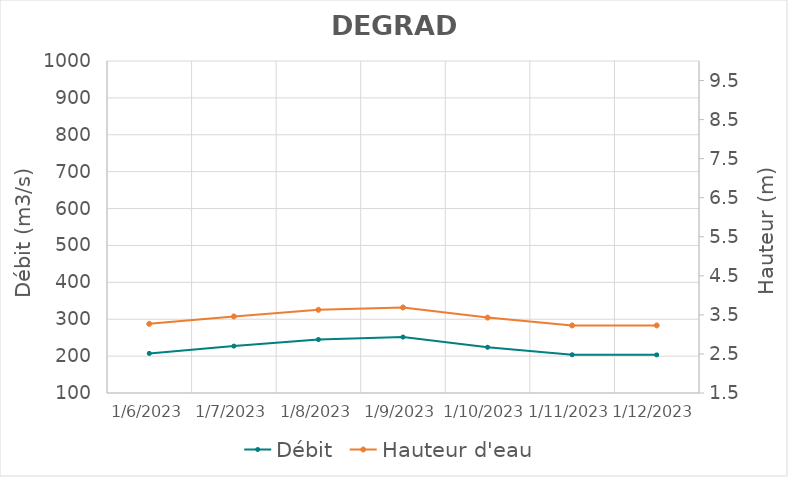
| Category | Débit |
|---|---|
| 6/29/22 | 434.28 |
| 6/28/22 | 304.07 |
| 6/27/22 | 278.42 |
| 6/26/22 | 300.35 |
| 6/25/22 | 334.04 |
| 6/24/22 | 355 |
| 6/23/22 | 376.79 |